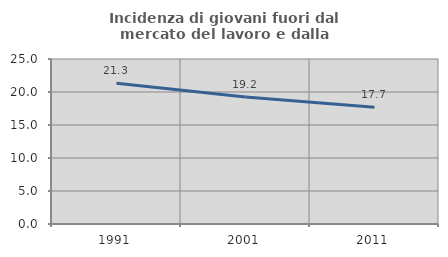
| Category | Incidenza di giovani fuori dal mercato del lavoro e dalla formazione  |
|---|---|
| 1991.0 | 21.314 |
| 2001.0 | 19.244 |
| 2011.0 | 17.688 |